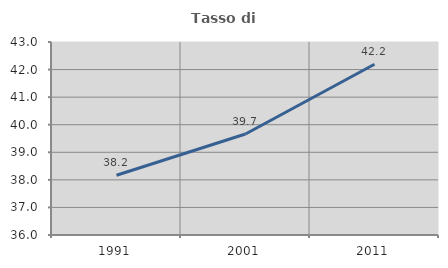
| Category | Tasso di occupazione   |
|---|---|
| 1991.0 | 38.167 |
| 2001.0 | 39.665 |
| 2011.0 | 42.194 |